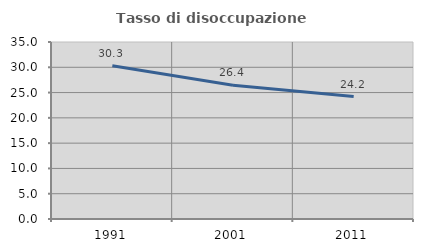
| Category | Tasso di disoccupazione giovanile  |
|---|---|
| 1991.0 | 30.303 |
| 2001.0 | 26.437 |
| 2011.0 | 24.219 |